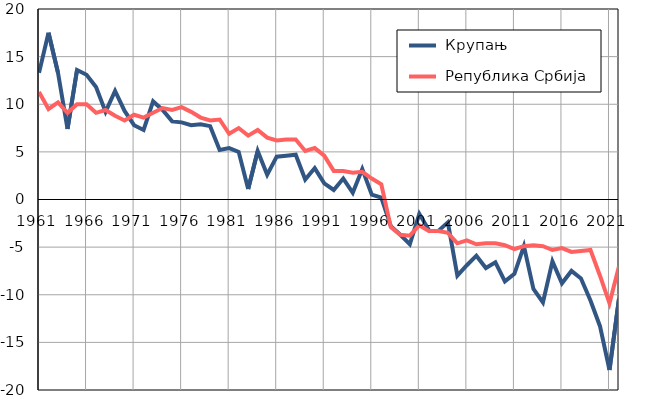
| Category |  Крупањ |  Република Србија |
|---|---|---|
| 1961.0 | 13.3 | 11.3 |
| 1962.0 | 17.5 | 9.5 |
| 1963.0 | 13.3 | 10.2 |
| 1964.0 | 7.4 | 9.1 |
| 1965.0 | 13.6 | 10 |
| 1966.0 | 13.1 | 10 |
| 1967.0 | 11.8 | 9.1 |
| 1968.0 | 9.2 | 9.4 |
| 1969.0 | 11.4 | 8.8 |
| 1970.0 | 9.3 | 8.3 |
| 1971.0 | 7.8 | 8.9 |
| 1972.0 | 7.3 | 8.6 |
| 1973.0 | 10.3 | 9.1 |
| 1974.0 | 9.4 | 9.6 |
| 1975.0 | 8.2 | 9.4 |
| 1976.0 | 8.1 | 9.7 |
| 1977.0 | 7.8 | 9.2 |
| 1978.0 | 7.9 | 8.6 |
| 1979.0 | 7.7 | 8.3 |
| 1980.0 | 5.2 | 8.4 |
| 1981.0 | 5.4 | 6.9 |
| 1982.0 | 5 | 7.5 |
| 1983.0 | 1.1 | 6.7 |
| 1984.0 | 5.1 | 7.3 |
| 1985.0 | 2.6 | 6.5 |
| 1986.0 | 4.5 | 6.2 |
| 1987.0 | 4.6 | 6.3 |
| 1988.0 | 4.7 | 6.3 |
| 1989.0 | 2.1 | 5.1 |
| 1990.0 | 3.3 | 5.4 |
| 1991.0 | 1.7 | 4.6 |
| 1992.0 | 1 | 3 |
| 1993.0 | 2.2 | 3 |
| 1994.0 | 0.7 | 2.8 |
| 1995.0 | 3.2 | 2.9 |
| 1996.0 | 0.5 | 2.2 |
| 1997.0 | 0.2 | 1.6 |
| 1998.0 | -2.8 | -2.9 |
| 1999.0 | -3.7 | -3.7 |
| 2000.0 | -4.7 | -3.8 |
| 2001.0 | -1.5 | -2.7 |
| 2002.0 | -3.2 | -3.3 |
| 2003.0 | -3.3 | -3.3 |
| 2004.0 | -2.4 | -3.5 |
| 2005.0 | -8 | -4.6 |
| 2006.0 | -6.9 | -4.3 |
| 2007.0 | -5.9 | -4.7 |
| 2008.0 | -7.2 | -4.6 |
| 2009.0 | -6.6 | -4.6 |
| 2010.0 | -8.6 | -4.8 |
| 2011.0 | -7.8 | -5.2 |
| 2012.0 | -4.9 | -4.9 |
| 2013.0 | -9.4 | -4.8 |
| 2014.0 | -10.8 | -4.9 |
| 2015.0 | -6.5 | -5.3 |
| 2016.0 | -8.8 | -5.1 |
| 2017.0 | -7.5 | -5.5 |
| 2018.0 | -8.3 | -5.4 |
| 2019.0 | -10.6 | -5.3 |
| 2020.0 | -13.3 | -8 |
| 2021.0 | -17.9 | -10.9 |
| 2022.0 | -10.4 | -7 |